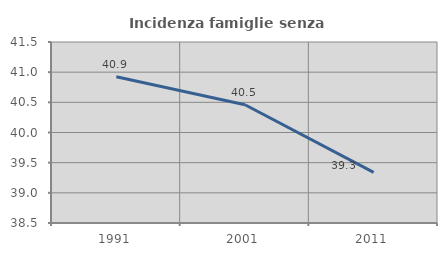
| Category | Incidenza famiglie senza nuclei |
|---|---|
| 1991.0 | 40.924 |
| 2001.0 | 40.461 |
| 2011.0 | 39.339 |